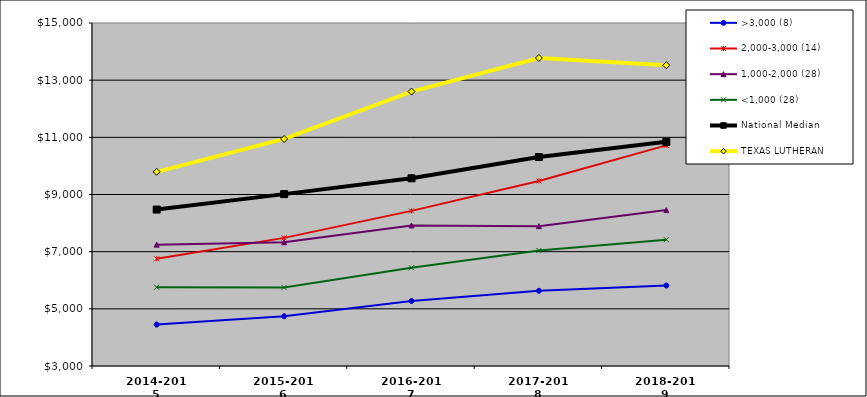
| Category | >3,000 (8) | 2,000-3,000 (14) | 1,000-2,000 (28) | <1,000 (28) | National Median | TEXAS LUTHERAN |
|---|---|---|---|---|---|---|
| 2014-2015 | 4449.045 | 6750.645 | 7245.606 | 5755.76 | 8473.314 | 9792.02 |
| 2015-2016 | 4740.686 | 7482.004 | 7328.953 | 5747.212 | 9013.486 | 10943.363 |
| 2016-2017 | 5274.959 | 8426.43 | 7916.917 | 6436.804 | 9566.64 | 12600.824 |
| 2017-2018 | 5629.823 | 9474.443 | 7892.293 | 7042.56 | 10311.147 | 13775.86 |
| 2018-2019 | 5814.827 | 10717.914 | 8454.798 | 7419.883 | 10842.044 | 13520.988 |